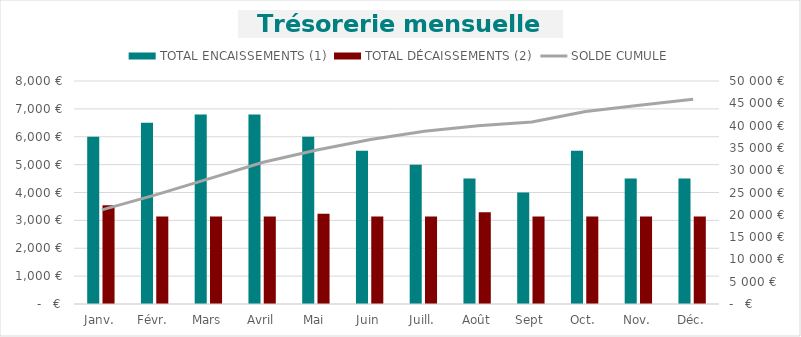
| Category | TOTAL ENCAISSEMENTS (1) | TOTAL DÉCAISSEMENTS (2) |
|---|---|---|
| Janv. | 6000 | 3541.36 |
| Févr. | 6500 | 3141.36 |
| Mars | 6800 | 3141.36 |
| Avril | 6800 | 3141.36 |
| Mai | 6000 | 3241.36 |
| Juin | 5500 | 3141.36 |
| Juill. | 5000 | 3141.36 |
| Août | 4500 | 3291.36 |
| Sept | 4000 | 3141.36 |
| Oct. | 5500 | 3141.36 |
| Nov. | 4500 | 3141.36 |
| Déc. | 4500 | 3141.36 |